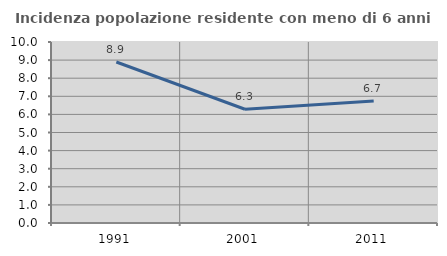
| Category | Incidenza popolazione residente con meno di 6 anni |
|---|---|
| 1991.0 | 8.895 |
| 2001.0 | 6.283 |
| 2011.0 | 6.744 |